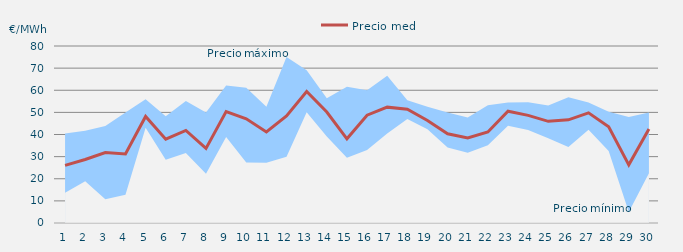
| Category | Precio medio |
|---|---|
| 1.0 | 26.029 |
| 2.0 | 28.693 |
| 3.0 | 31.827 |
| 4.0 | 31.224 |
| 5.0 | 48.147 |
| 6.0 | 37.856 |
| 7.0 | 41.821 |
| 8.0 | 33.705 |
| 9.0 | 50.365 |
| 10.0 | 47.08 |
| 11.0 | 41.137 |
| 12.0 | 48.437 |
| 13.0 | 59.446 |
| 14.0 | 50.167 |
| 15.0 | 38.04 |
| 16.0 | 48.73 |
| 17.0 | 52.363 |
| 18.0 | 51.42 |
| 19.0 | 46.352 |
| 20.0 | 40.338 |
| 21.0 | 38.426 |
| 22.0 | 41.155 |
| 23.0 | 50.533 |
| 24.0 | 48.648 |
| 25.0 | 45.955 |
| 26.0 | 46.628 |
| 27.0 | 49.789 |
| 28.0 | 43.517 |
| 29.0 | 26.284 |
| 30.0 | 42.511 |